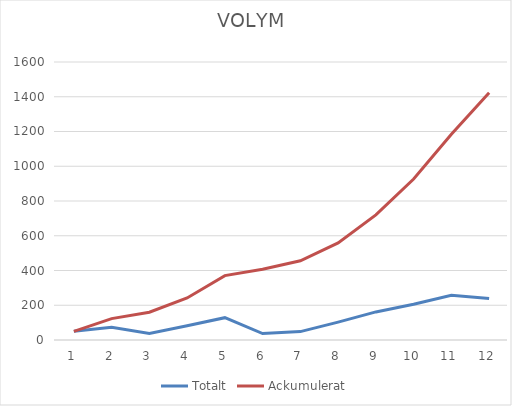
| Category | Totalt | Ackumulerat |
|---|---|---|
| 0 | 50 | 50 |
| 1 | 73 | 123 |
| 2 | 36.9 | 159.9 |
| 3 | 81.97 | 241.87 |
| 4 | 128.561 | 370.431 |
| 5 | 37.129 | 407.56 |
| 6 | 48.268 | 455.828 |
| 7 | 102.749 | 558.577 |
| 8 | 161.573 | 720.15 |
| 9 | 206.045 | 926.195 |
| 10 | 257.858 | 1184.053 |
| 11 | 239.216 | 1423.27 |